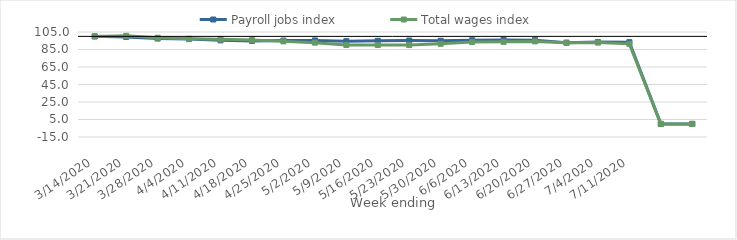
| Category | Payroll jobs index | Total wages index |
|---|---|---|
| 14/03/2020 | 100 | 100 |
| 21/03/2020 | 99.362 | 100.633 |
| 28/03/2020 | 97.511 | 98.427 |
| 04/04/2020 | 96.893 | 97.216 |
| 11/04/2020 | 95.444 | 96.623 |
| 18/04/2020 | 94.81 | 95.769 |
| 25/04/2020 | 95.222 | 94.285 |
| 02/05/2020 | 95.378 | 92.843 |
| 09/05/2020 | 94.473 | 90.149 |
| 16/05/2020 | 94.952 | 90.166 |
| 23/05/2020 | 95.24 | 90.054 |
| 30/05/2020 | 94.965 | 91.506 |
| 06/06/2020 | 95.592 | 93.501 |
| 13/06/2020 | 95.99 | 93.722 |
| 20/06/2020 | 95.705 | 94.249 |
| 27/06/2020 | 92.824 | 92.647 |
| 04/07/2020 | 93.502 | 92.887 |
| 11/07/2020 | 93.367 | 91.472 |